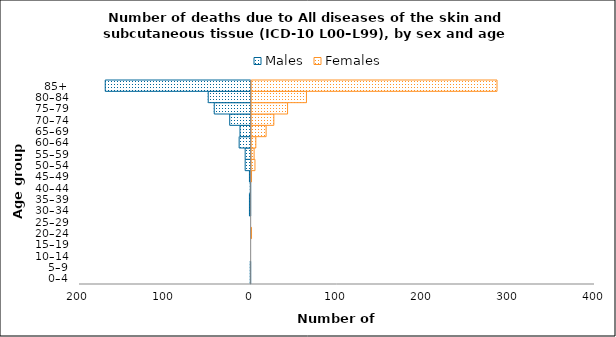
| Category | Males | Females |
|---|---|---|
| 0–4 | -1 | 0 |
| 5–9 | -1 | 0 |
| 10–14 | 0 | 0 |
| 15–19 | 0 | 0 |
| 20–24 | 0 | 1 |
| 25–29 | 0 | 0 |
| 30–34 | -2 | 0 |
| 35–39 | -2 | 0 |
| 40–44 | -1 | 0 |
| 45–49 | -2 | 1 |
| 50–54 | -7 | 5 |
| 55–59 | -7 | 4 |
| 60–64 | -14 | 6 |
| 65–69 | -13 | 18 |
| 70–74 | -25 | 27 |
| 75–79 | -43 | 43 |
| 80–84 | -50 | 65 |
| 85+ | -170 | 287 |